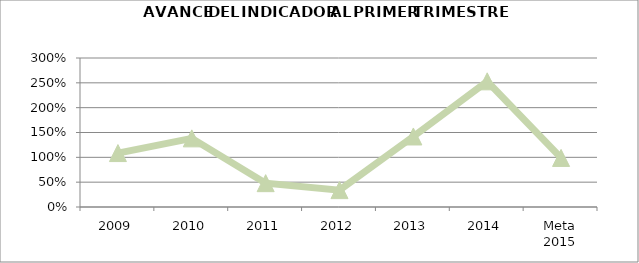
| Category | Series 2 |
|---|---|
| 2009 | 1.086 |
| 2010 | 1.382 |
| 2011 | 0.48 |
| 2012 | 0.34 |
| 2013 | 1.42 |
| 2014 | 2.53 |
| Meta 2015 | 0.988 |